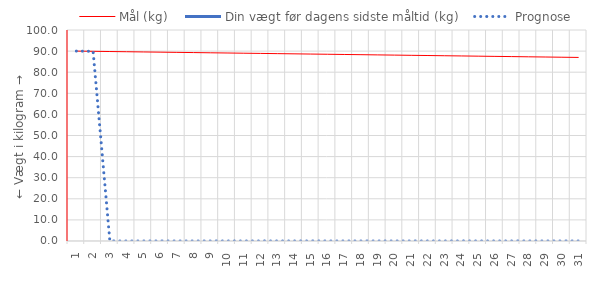
| Category | Mål (kg) | Din vægt før dagens sidste måltid (kg) | Prognose |
|---|---|---|---|
| 1.0 | 90 |  | 90 |
| 2.0 | 89.9 |  | 89.9 |
| 3.0 | 89.8 |  | 0 |
| 4.0 | 89.7 |  | 0 |
| 5.0 | 89.6 |  | 0 |
| 6.0 | 89.5 |  | 0 |
| 7.0 | 89.4 |  | 0 |
| 8.0 | 89.3 |  | 0 |
| 9.0 | 89.2 |  | 0 |
| 10.0 | 89.1 |  | 0 |
| 11.0 | 89 |  | 0 |
| 12.0 | 88.9 |  | 0 |
| 13.0 | 88.8 |  | 0 |
| 14.0 | 88.7 |  | 0 |
| 15.0 | 88.6 |  | 0 |
| 16.0 | 88.5 |  | 0 |
| 17.0 | 88.4 |  | 0 |
| 18.0 | 88.3 |  | 0 |
| 19.0 | 88.2 |  | 0 |
| 20.0 | 88.1 |  | 0 |
| 21.0 | 88 |  | 0 |
| 22.0 | 87.9 |  | 0 |
| 23.0 | 87.8 |  | 0 |
| 24.0 | 87.7 |  | 0 |
| 25.0 | 87.6 |  | 0 |
| 26.0 | 87.5 |  | 0 |
| 27.0 | 87.4 |  | 0 |
| 28.0 | 87.3 |  | 0 |
| 29.0 | 87.2 |  | 0 |
| 30.0 | 87.1 |  | 0 |
| 31.0 | 87 |  | 0 |